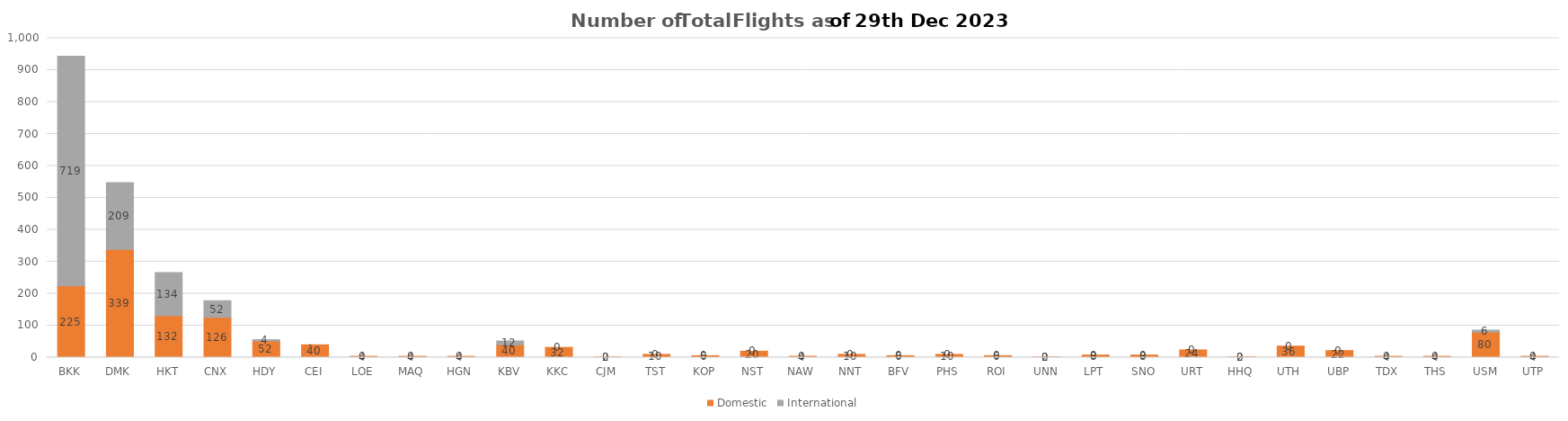
| Category | Domestic | International |
|---|---|---|
| BKK | 225 | 719 |
| DMK | 339 | 209 |
| HKT | 132 | 134 |
| CNX | 126 | 52 |
| HDY | 52 | 4 |
| CEI | 40 | 0 |
| LOE | 4 | 0 |
| MAQ | 4 | 0 |
| HGN | 4 | 0 |
| KBV | 40 | 12 |
| KKC | 32 | 0 |
| CJM | 2 | 0 |
| TST | 10 | 0 |
| KOP | 6 | 0 |
| NST | 20 | 0 |
| NAW | 4 | 0 |
| NNT | 10 | 0 |
| BFV | 6 | 0 |
| PHS | 10 | 0 |
| ROI | 6 | 0 |
| UNN | 2 | 0 |
| LPT | 8 | 0 |
| SNO | 8 | 0 |
| URT | 24 | 0 |
| HHQ | 2 | 0 |
| UTH | 36 | 0 |
| UBP | 22 | 0 |
| TDX | 4 | 0 |
| THS | 4 | 0 |
| USM | 80 | 6 |
| UTP | 4 | 0 |